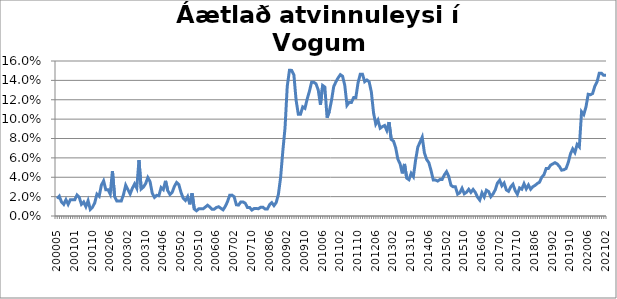
| Category | Series 0 |
|---|---|
| 200005 | 0.018 |
| 200006 | 0.02 |
| 200007 | 0.014 |
| 200008 | 0.012 |
| 200009 | 0.017 |
| 200010 | 0.012 |
| 200011 | 0.017 |
| 200012 | 0.017 |
| 200101 | 0.017 |
| 200102 | 0.022 |
| 200103 | 0.019 |
| 200104 | 0.012 |
| 200105 | 0.014 |
| 200106 | 0.01 |
| 200107 | 0.016 |
| 200109 | 0.007 |
| 200110 | 0.009 |
| 200111 | 0.014 |
| 200112 | 0.023 |
| 200201 | 0.02 |
| 200202 | 0.032 |
| 200203 | 0.036 |
| 200204 | 0.027 |
| 200205 | 0.027 |
| 200206 | 0.023 |
| 200207 | 0.046 |
| 200208 | 0.02 |
| 200209 | 0.015 |
| 200210 | 0.015 |
| 200211 | 0.015 |
| 200212 | 0.022 |
| 200301 | 0.032 |
| 200302 | 0.027 |
| 200303 | 0.023 |
| 200304 | 0.029 |
| 200305 | 0.033 |
| 200306 | 0.029 |
| 200307 | 0.058 |
| 200308 | 0.028 |
| 200309 | 0.03 |
| 200310 | 0.033 |
| 200311 | 0.04 |
| 200312 | 0.035 |
| 200401 | 0.023 |
| 200402 | 0.019 |
| 200403 | 0.021 |
| 200404 | 0.021 |
| 200405 | 0.029 |
| 200406 | 0.027 |
| 200407 | 0.036 |
| 200408 | 0.026 |
| 200409 | 0.022 |
| 200410 | 0.024 |
| 200411 | 0.031 |
| 200412 | 0.035 |
| 200501 | 0.032 |
| 200502 | 0.024 |
| 200503 | 0.018 |
| 200504 | 0.016 |
| 200505 | 0.02 |
| 200506 | 0.012 |
| 200507 | 0.023 |
| 200508 | 0.007 |
| 200509 | 0.005 |
| 200510 | 0.007 |
| 200511 | 0.007 |
| 200512 | 0.007 |
| 200601 | 0.009 |
| 200602 | 0.011 |
| 200603 | 0.009 |
| 200604 | 0.007 |
| 200605 | 0.007 |
| 200606 | 0.009 |
| 200607 | 0.01 |
| 200608 | 0.008 |
| 200609 | 0.006 |
| 200610 | 0.01 |
| 200611 | 0.015 |
| 200612 | 0.021 |
| 200701 | 0.022 |
| 200702 | 0.02 |
| 200703 | 0.012 |
| 200704 | 0.011 |
| 200705 | 0.014 |
| 200706 | 0.014 |
| 200707 | 0.013 |
| 200708 | 0.009 |
| 200709 | 0.009 |
| 200710 | 0.006 |
| 200711 | 0.008 |
| 200712 | 0.008 |
| 200801 | 0.008 |
| 200802 | 0.009 |
| 200803 | 0.009 |
| 200804 | 0.007 |
| 200805 | 0.007 |
| 200806 | 0.012 |
| 200807 | 0.014 |
| 200808 | 0.011 |
| 200809 | 0.014 |
| 200810 | 0.022 |
| 200811 | 0.04 |
| 200812 | 0.067 |
| 200901 | 0.091 |
| 200902 | 0.134 |
| 200903 | 0.15 |
| 200904 | 0.15 |
| 200905 | 0.146 |
| 200906 | 0.12 |
| 200907 | 0.105 |
| 200908 | 0.105 |
| 200909 | 0.113 |
| 200910 | 0.111 |
| 200911 | 0.121 |
| 200912 | 0.129 |
| 201001 | 0.138 |
| 201002 | 0.138 |
| 201003 | 0.136 |
| 201004 | 0.13 |
| 201005 | 0.115 |
| 201006 | 0.135 |
| 201007 | 0.133 |
| 201008 | 0.101 |
| 201009 | 0.108 |
| 201010 | 0.119 |
| 201011 | 0.134 |
| 201012 | 0.138 |
| 201101 | 0.143 |
| 201102 | 0.146 |
| 201103 | 0.144 |
| 201104 | 0.135 |
| 201105 | 0.114 |
| 201106 | 0.117 |
| 201107 | 0.117 |
| 201108 | 0.122 |
| 201109 | 0.122 |
| 201110 | 0.138 |
| 201111 | 0.146 |
| 201112 | 0.146 |
| 201201 | 0.139 |
| 201202 | 0.14 |
| 201203 | 0.139 |
| 201204 | 0.128 |
| 201205 | 0.106 |
| 201206 | 0.095 |
| 201207 | 0.099 |
| 201208 | 0.091 |
| 201209 | 0.092 |
| 201210 | 0.093 |
| 201211 | 0.088 |
| 201212 | 0.097 |
| 201301 | 0.079 |
| 201302 | 0.077 |
| 201303 | 0.07 |
| 201304 | 0.059 |
| 201305 | 0.054 |
| 201306 | 0.044 |
| 201307 | 0.054 |
| 201308 | 0.039 |
| 201309 | 0.037 |
| 201310 | 0.044 |
| 201311 | 0.041 |
| 201312 | 0.058 |
| 201401 | 0.071 |
| 201402 | 0.076 |
| 201403 | 0.081 |
| 201404 | 0.065 |
| 201405 | 0.058 |
| 201406 | 0.055 |
| 201407 | 0.047 |
| 201408 | 0.037 |
| 201409 | 0.037 |
| 201410 | 0.036 |
| 201411 | 0.038 |
| 201412 | 0.038 |
| 201501 | 0.042 |
| 201502 | 0.046 |
| 201503 | 0.041 |
| 201504 | 0.032 |
| 201505 | 0.03 |
| 201506 | 0.03 |
| 201507 | 0.023 |
| 201508 | 0.024 |
| 201509 | 0.029 |
| 201510 | 0.023 |
| 201511 | 0.025 |
| 201512 | 0.028 |
| 201601 | 0.024 |
| 201602 | 0.027 |
| 201603 | 0.024 |
| 201604 | 0.019 |
| 201605 | 0.016 |
| 201606 | 0.024 |
| 201607 | 0.02 |
| 201608 | 0.027 |
| 201609 | 0.025 |
| 201610 | 0.02 |
| 201611 | 0.023 |
| 201612 | 0.027 |
| 201701 | 0.034 |
| 201702 | 0.037 |
| 201703 | 0.031 |
| 201704 | 0.034 |
| 201705 | 0.027 |
| 201706 | 0.025 |
| 201707 | 0.03 |
| 201708 | 0.033 |
| 201709 | 0.026 |
| 201710 | 0.022 |
| 201711 | 0.029 |
| 201712 | 0.028 |
| 201801 | 0.033 |
| 201802 | 0.028 |
| 201803 | 0.032 |
| 201804 | 0.028 |
| 201805 | 0.03 |
| 201806 | 0.032 |
| 201807 | 0.034 |
| 201808 | 0.035 |
| 201809 | 0.04 |
| 201810 | 0.043 |
| 201811 | 0.049 |
| 201812 | 0.049 |
| 201901 | 0.052 |
| 201902 | 0.054 |
| 201903 | 0.055 |
| 201904 | 0.054 |
| 201905 | 0.051 |
| 201906 | 0.047 |
| 201907 | 0.048 |
| 201908 | 0.049 |
| 201909 | 0.055 |
| 201910 | 0.064 |
| 201911 | 0.069 |
| 201912 | 0.065 |
| 202001 | 0.074 |
| 202002 | 0.071 |
| 202003 | 0.108 |
| 202004 | 0.105 |
| 202005 | 0.113 |
| 202006 | 0.126 |
| 202007 | 0.125 |
| 202008 | 0.126 |
| 202009 | 0.134 |
| 202010 | 0.139 |
| 202011 | 0.147 |
| 202012 | 0.147 |
| 202101 | 0.145 |
| 202102 | 0.145 |